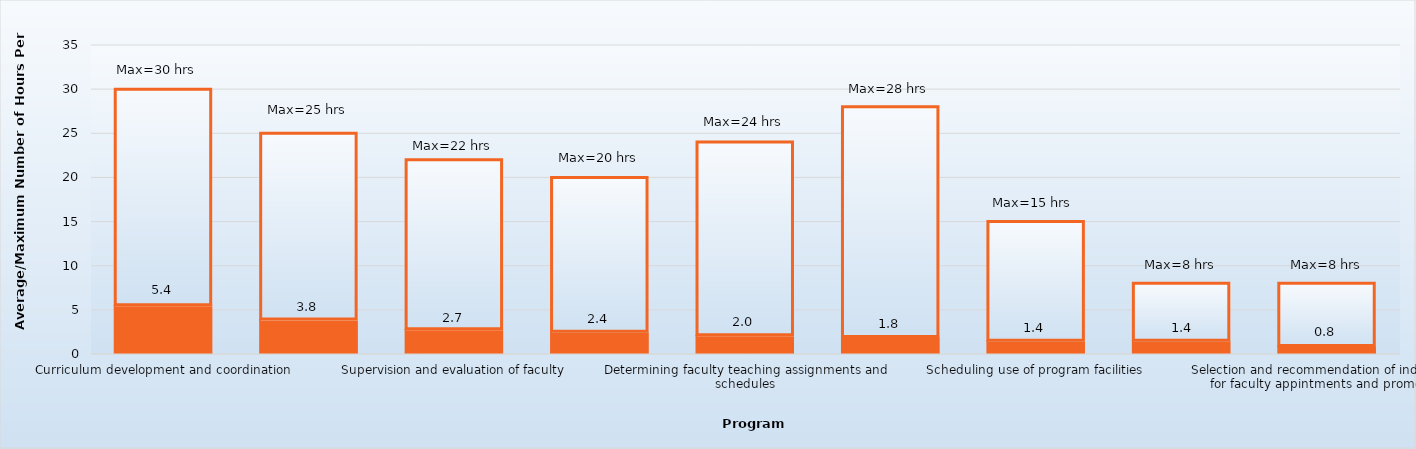
| Category | Average hours per week | Maximum |
|---|---|---|
| Curriculum development and coordination | 5.4 | 24.6 |
| Development and responsibilities to maintain CODA accreditation compliance and documentation | 3.8 | 21.2 |
| Supervision and evaluation of faculty | 2.7 | 19.3 |
| Fiscal administration | 2.4 | 17.6 |
| Determining faculty teaching assignments and schedules | 2 | 22 |
| Budget preparation | 1.8 | 26.2 |
| Scheduling use of program facilities | 1.4 | 13.6 |
| Determining admissions criteria and procedures | 1.4 | 6.6 |
| Selection and recommendation of individuals for faculty appintments and promotion | 0.8 | 7.2 |